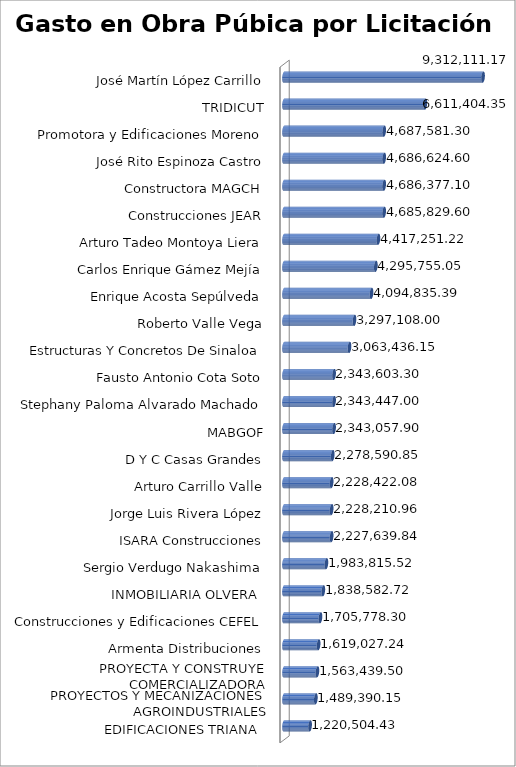
| Category | Suma  |
|---|---|
| EDIFICACIONES TRIANA  | 1220504.43 |
| PROYECTOS Y MECANIZACIONES AGROINDUSTRIALES | 1489390.15 |
| PROYECTA Y CONSTRUYE COMERCIALIZADORA | 1563439.5 |
| Armenta Distribuciones | 1619027.24 |
| Construcciones y Edificaciones CEFEL | 1705778.3 |
| INMOBILIARIA OLVERA  | 1838582.72 |
| Sergio Verdugo Nakashima | 1983815.52 |
| ISARA Construcciones | 2227639.84 |
| Jorge Luis Rivera López | 2228210.96 |
| Arturo Carrillo Valle | 2228422.08 |
| D Y C Casas Grandes | 2278590.85 |
| MABGOF | 2343057.9 |
| Stephany Paloma Alvarado Machado | 2343447 |
| Fausto Antonio Cota Soto | 2343603.3 |
| Estructuras Y Concretos De Sinaloa | 3063436.15 |
| Roberto Valle Vega | 3297108 |
| Enrique Acosta Sepúlveda | 4094835.39 |
| Carlos Enrique Gámez Mejía | 4295755.05 |
| Arturo Tadeo Montoya Liera | 4417251.22 |
| Construcciones JEAR | 4685829.6 |
| Constructora MAGCH | 4686377.1 |
| José Rito Espinoza Castro | 4686624.6 |
| Promotora y Edificaciones Moreno | 4687581.3 |
| TRIDICUT | 6611404.35 |
| José Martín López Carrillo | 9312111.17 |